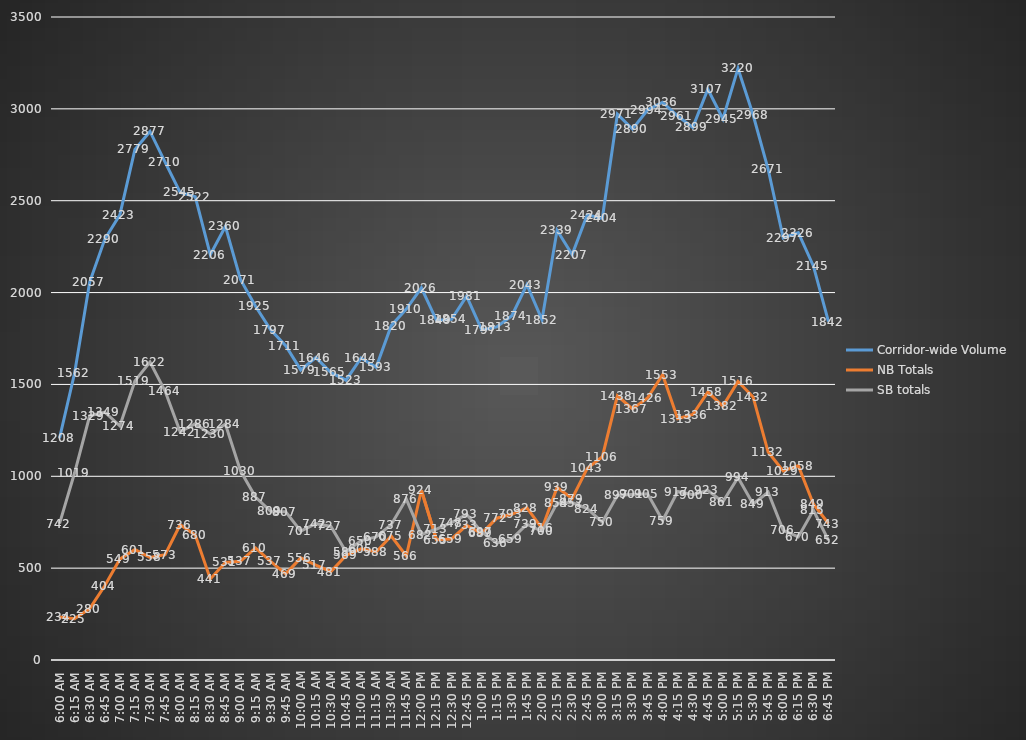
| Category | Corridor-wide Volume | NB Totals | SB totals |
|---|---|---|---|
| 6:00 AM | 1208 | 234 | 742 |
| 6:15 AM | 1562 | 225 | 1019 |
| 6:30 AM | 2057 | 280 | 1329 |
| 6:45 AM | 2290 | 404 | 1349 |
| 7:00 AM | 2423 | 549 | 1274 |
| 7:15 AM | 2779 | 601 | 1519 |
| 7:30 AM | 2877 | 558 | 1622 |
| 7:45 AM | 2710 | 573 | 1464 |
| 8:00 AM | 2545 | 736 | 1242 |
| 8:15 AM | 2522 | 680 | 1286 |
| 8:30 AM | 2206 | 441 | 1230 |
| 8:45 AM | 2360 | 531 | 1284 |
| 9:00 AM | 2071 | 537 | 1030 |
| 9:15 AM | 1925 | 610 | 887 |
| 9:30 AM | 1797 | 537 | 809 |
| 9:45 AM | 1711 | 469 | 807 |
| 10:00 AM | 1579 | 556 | 701 |
| 10:15 AM | 1646 | 517 | 742 |
| 10:30 AM | 1565 | 481 | 727 |
| 10:45 AM | 1523 | 569 | 589 |
| 11:00 AM | 1644 | 605 | 650 |
| 11:15 AM | 1593 | 588 | 670 |
| 11:30 AM | 1820 | 675 | 737 |
| 11:45 AM | 1910 | 566 | 876 |
| 12:00 PM | 2026 | 924 | 682 |
| 12:15 PM | 1849 | 655 | 713 |
| 12:30 PM | 1854 | 659 | 748 |
| 12:45 PM | 1981 | 733 | 793 |
| 1:00 PM | 1797 | 689 | 697 |
| 1:15 PM | 1813 | 772 | 636 |
| 1:30 PM | 1874 | 793 | 659 |
| 1:45 PM | 2043 | 828 | 739 |
| 2:00 PM | 1852 | 716 | 700 |
| 2:15 PM | 2339 | 939 | 854 |
| 2:30 PM | 2207 | 879 | 857 |
| 2:45 PM | 2424 | 1043 | 824 |
| 3:00 PM | 2404 | 1106 | 750 |
| 3:15 PM | 2971 | 1438 | 897 |
| 3:30 PM | 2890 | 1367 | 901 |
| 3:45 PM | 2994 | 1426 | 905 |
| 4:00 PM | 3036 | 1553 | 759 |
| 4:15 PM | 2961 | 1313 | 917 |
| 4:30 PM | 2899 | 1336 | 900 |
| 4:45 PM | 3107 | 1458 | 923 |
| 5:00 PM | 2945 | 1382 | 861 |
| 5:15 PM | 3220 | 1516 | 994 |
| 5:30 PM | 2968 | 1432 | 849 |
| 5:45 PM | 2671 | 1132 | 913 |
| 6:00 PM | 2297 | 1029 | 706 |
| 6:15 PM | 2326 | 1058 | 670 |
| 6:30 PM | 2145 | 849 | 815 |
| 6:45 PM | 1842 | 743 | 652 |